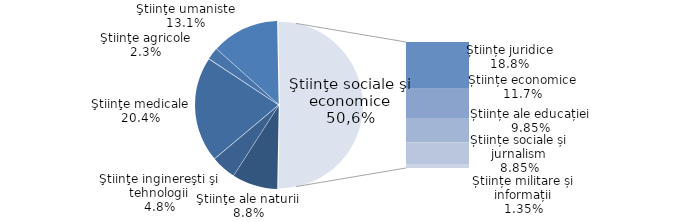
| Category | Series 0 |
|---|---|
| Ştiinţe ale naturii | 8.8 |
| Ştiinţe inginereşti şi tehnologii | 4.8 |
| Ştiinţe medicale | 20.4 |
| Ştiinţe agricole | 2.3 |
| Ştiinţe umaniste | 13.1 |
| Științe juridice | 18.8 |
| Științe economice | 11.7 |
| Științe ale educației | 9.85 |
| Științe sociale și jurnalism | 8.85 |
| Științe militare și informații | 1.35 |